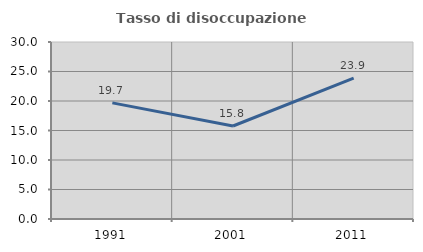
| Category | Tasso di disoccupazione giovanile  |
|---|---|
| 1991.0 | 19.683 |
| 2001.0 | 15.764 |
| 2011.0 | 23.881 |